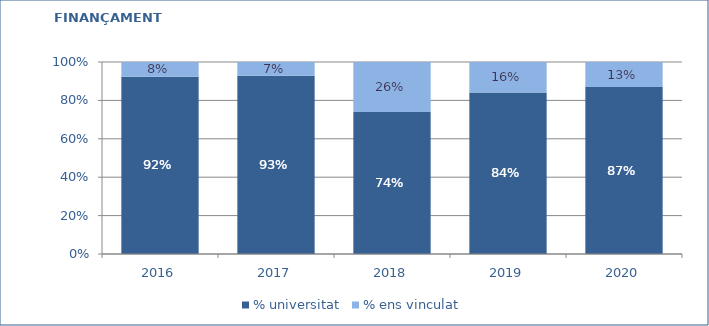
| Category | % universitat | % ens vinculat |
|---|---|---|
| 2016.0 | 0.923 | 0.077 |
| 2017.0 | 0.928 | 0.072 |
| 2018.0 | 0.739 | 0.261 |
| 2019.0 | 0.841 | 0.159 |
| 2020.0 | 0.869 | 0.131 |